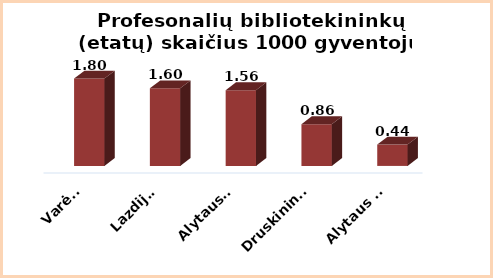
| Category | Series 0 |
|---|---|
| Varėna | 1.8 |
| Lazdijai | 1.6 |
| Alytaus r. | 1.56 |
| Druskininkai | 0.86 |
| Alytaus m. | 0.44 |